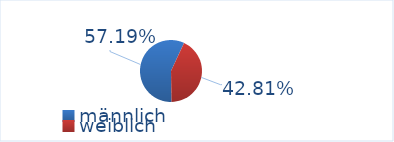
| Category | Series 0 |
|---|---|
| männlich | 57.193 |
| weiblich | 42.807 |